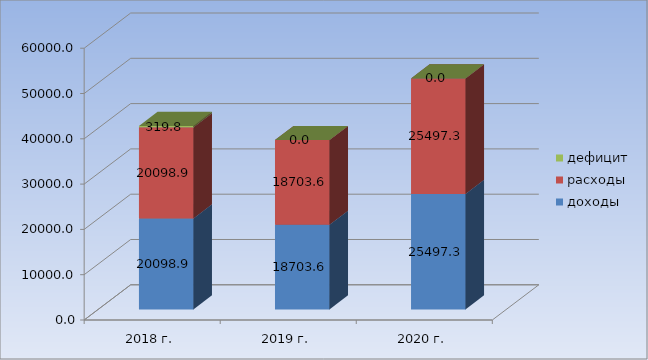
| Category | доходы | расходы | дефицит |
|---|---|---|---|
| 2018 г. | 20098.9 | 20098.9 | 319.8 |
| 2019 г. | 18703.6 | 18703.6 | 0 |
| 2020 г. | 25497.3 | 25497.3 | 0 |